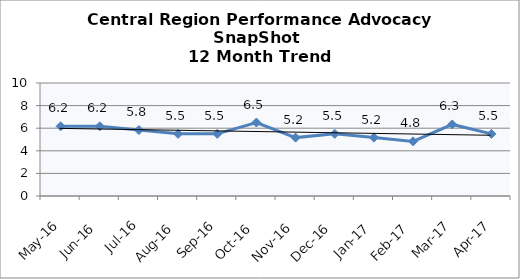
| Category | Central Region |
|---|---|
| May-16 | 6.167 |
| Jun-16 | 6.167 |
| Jul-16 | 5.833 |
| Aug-16 | 5.5 |
| Sep-16 | 5.5 |
| Oct-16 | 6.5 |
| Nov-16 | 5.167 |
| Dec-16 | 5.5 |
| Jan-17 | 5.167 |
| Feb-17 | 4.833 |
| Mar-17 | 6.333 |
| Apr-17 | 5.5 |